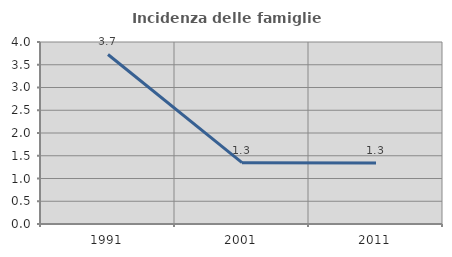
| Category | Incidenza delle famiglie numerose |
|---|---|
| 1991.0 | 3.726 |
| 2001.0 | 1.349 |
| 2011.0 | 1.343 |